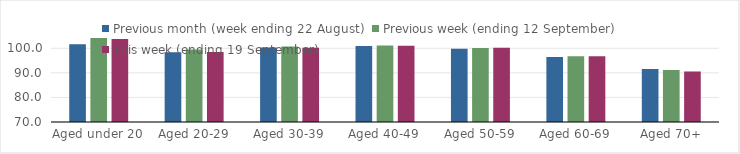
| Category | Previous month (week ending 22 August) | Previous week (ending 12 September) | This week (ending 19 September) |
|---|---|---|---|
| Aged under 20 | 101.63 | 104.15 | 103.79 |
| Aged 20-29 | 98.43 | 99.5 | 98.49 |
| Aged 30-39 | 100.31 | 100.74 | 100.24 |
| Aged 40-49 | 100.91 | 101.1 | 101.04 |
| Aged 50-59 | 99.83 | 100.14 | 100.25 |
| Aged 60-69 | 96.43 | 96.73 | 96.78 |
| Aged 70+ | 91.54 | 91.18 | 90.56 |